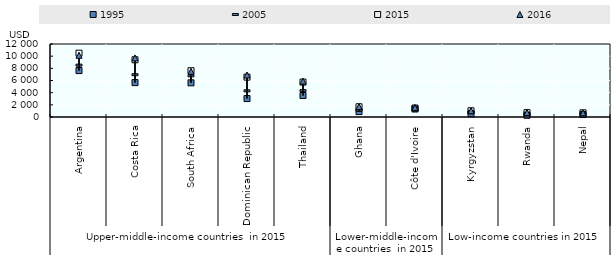
| Category | 1995 | 2005 | 2015 | 2016 |
|---|---|---|---|---|
| 0 | 7630.022 | 8522.523 | 10490.02 | 10148.51 |
| 1 | 5651.68 | 6954.039 | 9406.757 | 9714.1 |
| 2 | 5617.191 | 6768.557 | 7605.395 | 7504.295 |
| 3 | 3032.791 | 4301.885 | 6552.693 | 6909.13 |
| 4 | 3530.294 | 4337.263 | 5733.921 | 5901.426 |
| 5 | 886.477 | 1089.468 | 1685.986 | 1707.662 |
| 6 | 1314.12 | 1216.208 | 1474.058 | 1563.371 |
| 7 | 535.044 | 747.566 | 1021.161 | 1038.308 |
| 8 | 280.499 | 430.634 | 714.543 | 738.639 |
| 9 | 403.052 | 502.239 | 686.084 | 682.158 |